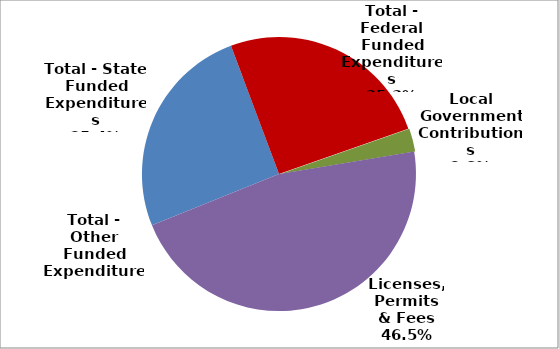
| Category | Series 0 |
|---|---|
| Total - State Funded Expenditures | 385284 |
| Total - Federal Funded Expenditures | 384145 |
| Local Government Contributions | 41808 |
| Licenses, Permits & Fees | 705153 |
| Total - Other Funded Expenditures | 0 |